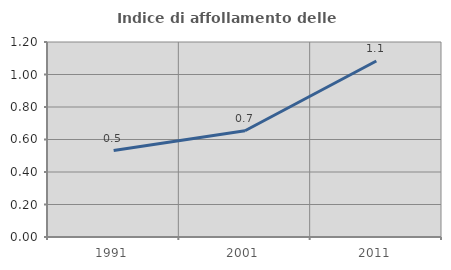
| Category | Indice di affollamento delle abitazioni  |
|---|---|
| 1991.0 | 0.532 |
| 2001.0 | 0.654 |
| 2011.0 | 1.083 |